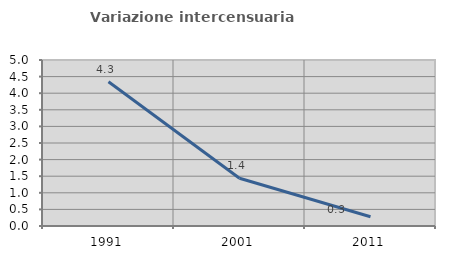
| Category | Variazione intercensuaria annua |
|---|---|
| 1991.0 | 4.346 |
| 2001.0 | 1.437 |
| 2011.0 | 0.277 |